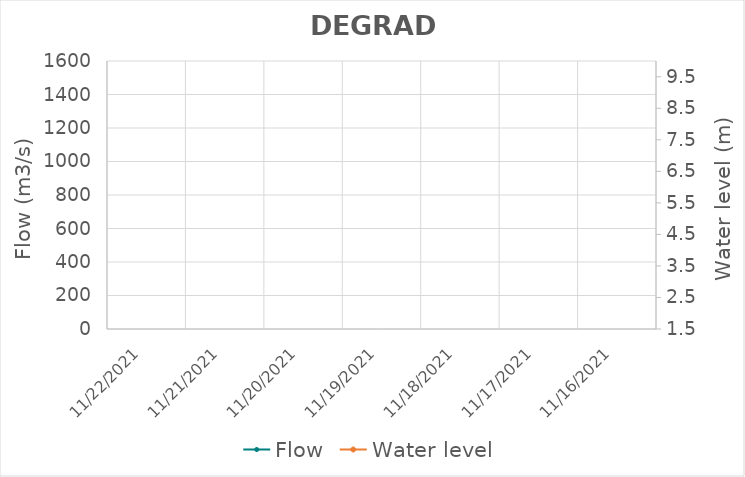
| Category | Flow |
|---|---|
| 11/1/21 | 443.47 |
| 10/31/21 | 452.58 |
| 10/30/21 | 621.63 |
| 10/29/21 | 505.25 |
| 10/28/21 | 508.33 |
| 10/27/21 | 488.37 |
| 10/26/21 | 466.42 |